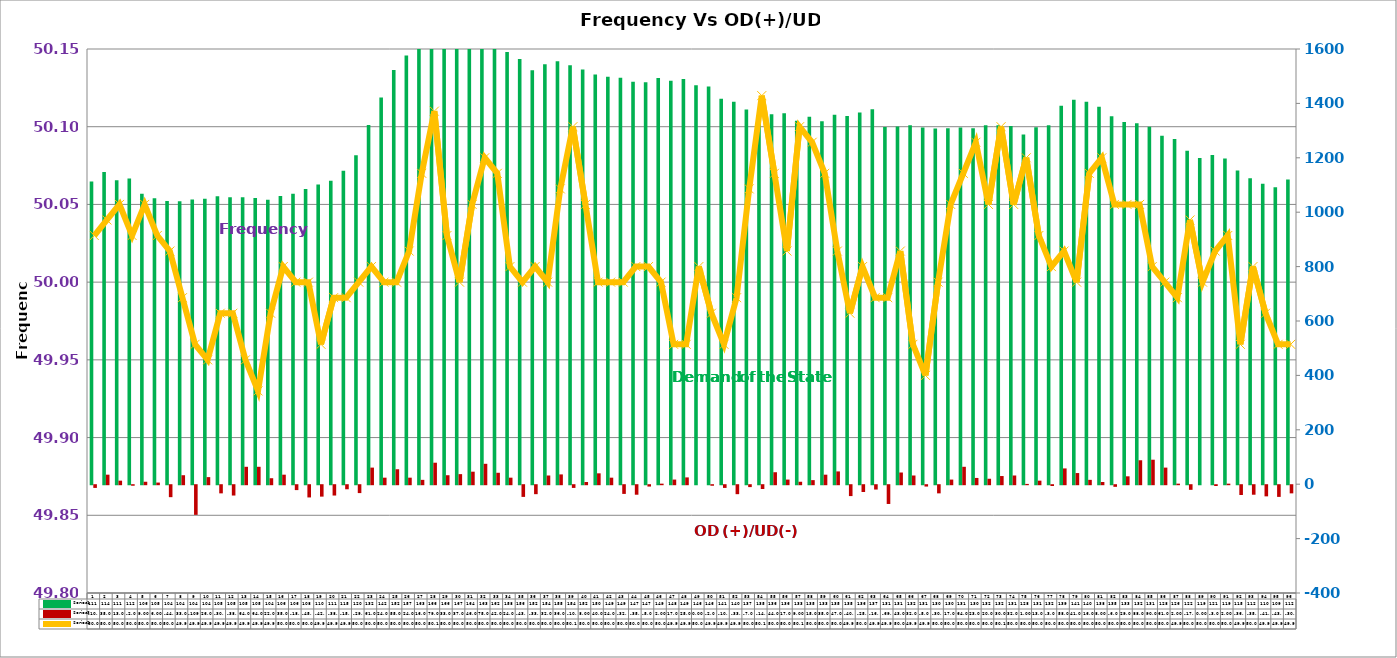
| Category | Series 2 | Series 4 |
|---|---|---|
| 0 | 1112.667 | -10 |
| 1 | 1148 | 35 |
| 2 | 1117.467 | 13 |
| 3 | 1124 | -2 |
| 4 | 1068 | 9 |
| 5 | 1051 | 6 |
| 6 | 1041 | -44 |
| 7 | 1040 | 33 |
| 8 | 1047 | -109 |
| 9 | 1049 | 26 |
| 10 | 1059 | -30 |
| 11 | 1055 | -38 |
| 12 | 1055 | 64 |
| 13 | 1052 | 64 |
| 14 | 1046 | 22 |
| 15 | 1060 | 35 |
| 16 | 1068 | -18 |
| 17 | 1085 | -45 |
| 18 | 1102 | -42 |
| 19 | 1116 | -38 |
| 20 | 1152 | -15 |
| 21 | 1209 | -29 |
| 22 | 1321 | 61 |
| 23 | 1422 | 24 |
| 24 | 1523 | 55 |
| 25 | 1576 | 24 |
| 26 | 1630 | 16 |
| 27 | 1661 | 79 |
| 28 | 1667 | 33 |
| 29 | 1678 | 37 |
| 30 | 1643 | 46 |
| 31 | 1639 | 75 |
| 32 | 1628 | 42 |
| 33 | 1589 | 24 |
| 34 | 1563 | -43 |
| 35 | 1522 | -33 |
| 36 | 1544 | 32 |
| 37 | 1555 | 36 |
| 38 | 1540 | -10 |
| 39 | 1525 | 8 |
| 40 | 1506 | 40 |
| 41 | 1498 | 24 |
| 42 | 1494 | -32 |
| 43 | 1479.2 | -35 |
| 44 | 1478 | -5 |
| 45 | 1493 | 2 |
| 46 | 1483 | 17 |
| 47 | 1490 | 25 |
| 48 | 1467 | 0 |
| 49 | 1462 | -2 |
| 50 | 1417 | -10 |
| 51 | 1406 | -33 |
| 52 | 1378 | -7 |
| 53 | 1354 | -14 |
| 54 | 1360 | 44 |
| 55 | 1364 | 17 |
| 56 | 1336 | 9 |
| 57 | 1351 | 15 |
| 58 | 1334 | 35 |
| 59 | 1358 | 47 |
| 60 | 1354 | -40 |
| 61 | 1367 | -25 |
| 62 | 1378.14 | -16 |
| 63 | 1312.783 | -69 |
| 64 | 1315 | 43 |
| 65 | 1320 | 32 |
| 66 | 1311 | -5 |
| 67 | 1308 | -30 |
| 68 | 1309 | 17 |
| 69 | 1311 | 64 |
| 70 | 1309 | 23 |
| 71 | 1320 | 20 |
| 72 | 1320 | 30 |
| 73 | 1317 | 32 |
| 74 | 1286 | 1 |
| 75 | 1312 | 13 |
| 76 | 1320 | -3 |
| 77 | 1391 | 58 |
| 78 | 1413 | 41 |
| 79 | 1406 | 16 |
| 80 | 1388 | 8 |
| 81 | 1353 | -6 |
| 82 | 1332 | 29 |
| 83 | 1327 | 88 |
| 84 | 1314 | 90 |
| 85 | 1281 | 61 |
| 86 | 1269 | 2 |
| 87 | 1226 | -17 |
| 88 | 1199 | 0 |
| 89 | 1210 | -3 |
| 90 | 1197 | 2 |
| 91 | 1153 | -36 |
| 92 | 1125 | -35 |
| 93 | 1105 | -41 |
| 94 | 1092 | -43 |
| 95 | 1120.2 | -30 |